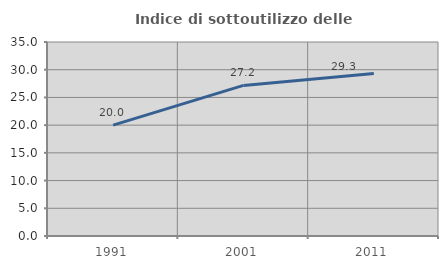
| Category | Indice di sottoutilizzo delle abitazioni  |
|---|---|
| 1991.0 | 20 |
| 2001.0 | 27.168 |
| 2011.0 | 29.327 |